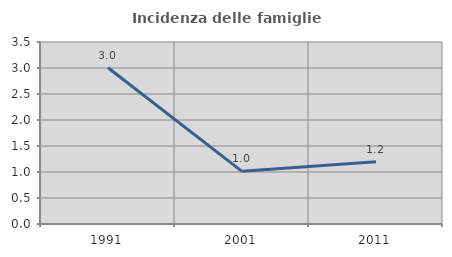
| Category | Incidenza delle famiglie numerose |
|---|---|
| 1991.0 | 3.005 |
| 2001.0 | 1.013 |
| 2011.0 | 1.198 |